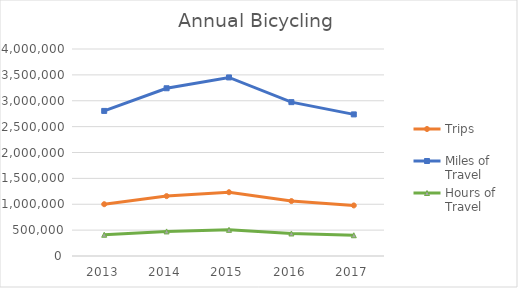
| Category | Trips | Miles of Travel | Hours of Travel |
|---|---|---|---|
| 2013 | 1000889.627 | 2803501.855 | 410534.398 |
| 2014 | 1157197.63 | 3241322.133 | 474647.173 |
| 2015 | 1231941.783 | 3450681.253 | 505304.945 |
| 2016 | 1061441.553 | 2973108.405 | 435370.951 |
| 2017 | 976917.026 | 2736354.358 | 400701.568 |